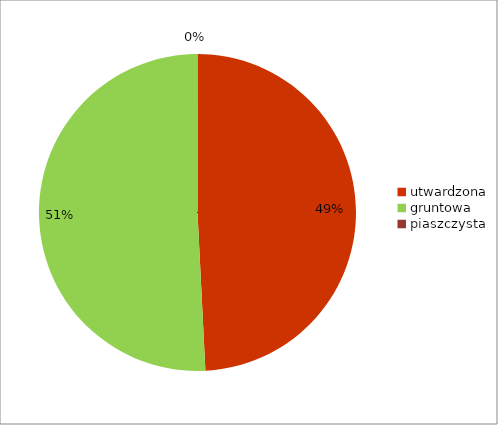
| Category | Series 0 |
|---|---|
| utwardzona | 0.492 |
| gruntowa | 0.508 |
| piaszczysta | 0 |